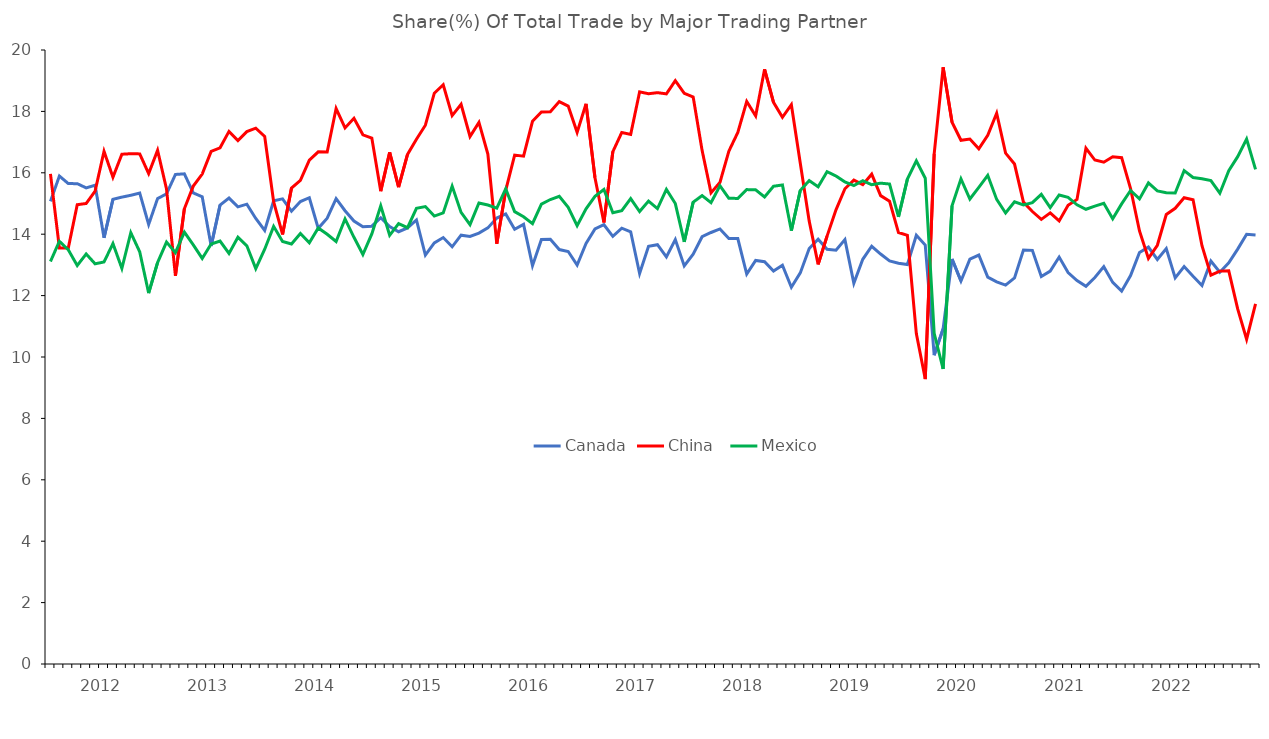
| Category | Canada | China  | Mexico |
|---|---|---|---|
| nan | 15.071 | 15.965 | 13.111 |
| nan | 15.895 | 13.552 | 13.769 |
| nan | 15.648 | 13.554 | 13.49 |
| nan | 15.647 | 14.961 | 12.98 |
| nan | 15.509 | 15.001 | 13.356 |
| nan | 15.594 | 15.401 | 13.035 |
| 2012.0 | 13.882 | 16.7 | 13.096 |
| nan | 15.137 | 15.856 | 13.695 |
| nan | 15.208 | 16.605 | 12.886 |
| nan | 15.267 | 16.622 | 14.048 |
| nan | 15.34 | 16.616 | 13.425 |
| nan | 14.317 | 15.975 | 12.081 |
| nan | 15.16 | 16.732 | 13.074 |
| nan | 15.313 | 15.473 | 13.744 |
| nan | 15.946 | 12.642 | 13.397 |
| nan | 15.966 | 14.829 | 14.069 |
| nan | 15.345 | 15.567 | 13.654 |
| nan | 15.218 | 15.957 | 13.211 |
| 2013.0 | 13.619 | 16.695 | 13.68 |
| nan | 14.952 | 16.814 | 13.777 |
| nan | 15.177 | 17.349 | 13.374 |
| nan | 14.889 | 17.049 | 13.902 |
| nan | 14.978 | 17.34 | 13.622 |
| nan | 14.514 | 17.453 | 12.879 |
| nan | 14.125 | 17.184 | 13.511 |
| nan | 15.089 | 15.06 | 14.256 |
| nan | 15.153 | 13.992 | 13.762 |
| nan | 14.748 | 15.5 | 13.681 |
| nan | 15.063 | 15.755 | 14.024 |
| nan | 15.188 | 16.409 | 13.722 |
| 2014.0 | 14.191 | 16.684 | 14.204 |
| nan | 14.521 | 16.679 | 13.999 |
| nan | 15.159 | 18.094 | 13.763 |
| nan | 14.766 | 17.462 | 14.498 |
| nan | 14.43 | 17.776 | 13.899 |
| nan | 14.24 | 17.238 | 13.338 |
| nan | 14.261 | 17.131 | 14.008 |
| nan | 14.535 | 15.401 | 14.922 |
| nan | 14.249 | 16.668 | 13.964 |
| nan | 14.08 | 15.533 | 14.342 |
| nan | 14.205 | 16.601 | 14.211 |
| nan | 14.465 | 17.091 | 14.845 |
| 2015.0 | 13.32 | 17.551 | 14.899 |
| nan | 13.718 | 18.594 | 14.591 |
| nan | 13.89 | 18.869 | 14.694 |
| nan | 13.59 | 17.864 | 15.567 |
| nan | 13.969 | 18.23 | 14.71 |
| nan | 13.924 | 17.182 | 14.313 |
| nan | 14.034 | 17.641 | 15.017 |
| nan | 14.205 | 16.612 | 14.95 |
| nan | 14.526 | 13.688 | 14.849 |
| nan | 14.66 | 15.428 | 15.476 |
| nan | 14.163 | 16.577 | 14.736 |
| nan | 14.322 | 16.543 | 14.567 |
| 2016.0 | 12.975 | 17.678 | 14.346 |
| nan | 13.825 | 17.983 | 14.982 |
| nan | 13.833 | 17.986 | 15.13 |
| nan | 13.499 | 18.319 | 15.232 |
| nan | 13.437 | 18.174 | 14.877 |
| nan | 12.997 | 17.317 | 14.275 |
| nan | 13.701 | 18.247 | 14.826 |
| nan | 14.171 | 15.839 | 15.236 |
| nan | 14.308 | 14.382 | 15.456 |
| nan | 13.929 | 16.687 | 14.7 |
| nan | 14.198 | 17.312 | 14.769 |
| nan | 14.079 | 17.251 | 15.157 |
| 2017.0 | 12.717 | 18.637 | 14.736 |
| nan | 13.604 | 18.575 | 15.079 |
| nan | 13.657 | 18.611 | 14.833 |
| nan | 13.259 | 18.571 | 15.456 |
| nan | 13.826 | 19.001 | 14.999 |
| nan | 12.966 | 18.589 | 13.75 |
| nan | 13.346 | 18.469 | 15.043 |
| nan | 13.919 | 16.732 | 15.257 |
| nan | 14.056 | 15.349 | 15.028 |
| nan | 14.172 | 15.686 | 15.579 |
| nan | 13.861 | 16.706 | 15.168 |
| nan | 13.858 | 17.313 | 15.166 |
| 2018.0 | 12.699 | 18.324 | 15.453 |
| nan | 13.146 | 17.853 | 15.445 |
| nan | 13.106 | 19.372 | 15.213 |
| nan | 12.797 | 18.296 | 15.562 |
| nan | 12.987 | 17.807 | 15.604 |
| nan | 12.271 | 18.22 | 14.116 |
| nan | 12.739 | 16.311 | 15.424 |
| nan | 13.533 | 14.424 | 15.746 |
| nan | 13.838 | 13.016 | 15.544 |
| nan | 13.506 | 13.938 | 16.036 |
| nan | 13.479 | 14.793 | 15.896 |
| nan | 13.825 | 15.48 | 15.702 |
| 2019.0 | 12.399 | 15.761 | 15.585 |
| nan | 13.182 | 15.615 | 15.742 |
| nan | 13.607 | 15.955 | 15.612 |
| nan | 13.353 | 15.256 | 15.662 |
| nan | 13.13 | 15.075 | 15.634 |
| nan | 13.055 | 14.053 | 14.567 |
| nan | 13.013 | 13.965 | 15.796 |
| nan | 13.967 | 10.765 | 16.39 |
| nan | 13.645 | 9.281 | 15.823 |
| nan | 10.06 | 16.616 | 10.773 |
| nan | 10.918 | 19.436 | 9.609 |
| nan | 13.194 | 17.646 | 14.926 |
| 2020.0 | 12.476 | 17.06 | 15.803 |
| nan | 13.188 | 17.1 | 15.146 |
| nan | 13.321 | 16.782 | 15.523 |
| nan | 12.602 | 17.224 | 15.917 |
| nan | 12.446 | 17.94 | 15.133 |
| nan | 12.342 | 16.639 | 14.69 |
| nan | 12.578 | 16.285 | 15.055 |
| nan | 13.488 | 15.044 | 14.956 |
| nan | 13.474 | 14.739 | 15.03 |
| nan | 12.621 | 14.483 | 15.297 |
| nan | 12.798 | 14.693 | 14.869 |
| nan | 13.256 | 14.433 | 15.279 |
| 2021.0 | 12.752 | 14.94 | 15.204 |
| nan | 12.491 | 15.132 | 14.956 |
| nan | 12.302 | 16.801 | 14.812 |
| nan | 12.591 | 16.416 | 14.913 |
| nan | 12.943 | 16.344 | 15.005 |
| nan | 12.429 | 16.521 | 14.5 |
| nan | 12.144 | 16.494 | 14.986 |
| nan | 12.651 | 15.484 | 15.424 |
| nan | 13.406 | 14.105 | 15.15 |
| nan | 13.58 | 13.212 | 15.669 |
| nan | 13.177 | 13.641 | 15.409 |
| nan | 13.53 | 14.641 | 15.349 |
| 2022.0 | 12.575 | 14.845 | 15.344 |
| nan | 12.945 | 15.189 | 16.07 |
| nan | 12.63 | 15.124 | 15.846 |
| nan | 12.329 | 13.626 | 15.809 |
| nan | 13.128 | 12.667 | 15.747 |
| nan | 12.763 | 12.797 | 15.336 |
| nan | 13.067 | 12.806 | 16.067 |
| nan | 13.515 | 11.567 | 16.525 |
| nan | 13.999 | 10.579 | 17.098 |
| nan | 13.978 | 11.733 | 16.11 |